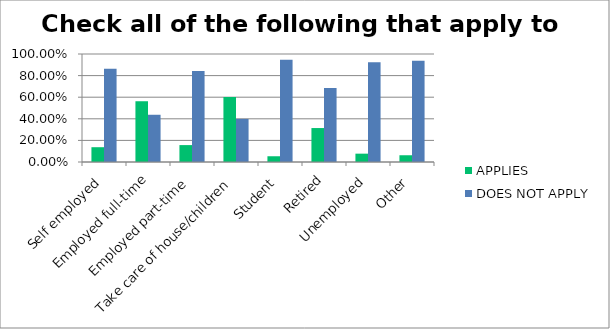
| Category | APPLIES | DOES NOT APPLY |
|---|---|---|
| Self employed | 0.137 | 0.863 |
| Employed full-time | 0.563 | 0.437 |
| Employed part-time | 0.156 | 0.843 |
| Take care of house/children | 0.601 | 0.399 |
| Student | 0.053 | 0.947 |
| Retired | 0.314 | 0.686 |
| Unemployed | 0.077 | 0.923 |
| Other | 0.062 | 0.938 |